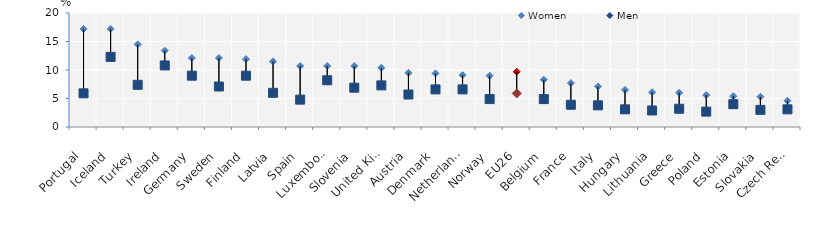
| Category | Women | Men |
|---|---|---|
| Portugal | 17.2 | 5.9 |
| Iceland | 17.2 | 12.3 |
| Turkey | 14.5 | 7.4 |
| Ireland | 13.4 | 10.8 |
| Germany | 12.1 | 9 |
| Sweden | 12.1 | 7.1 |
| Finland | 11.9 | 9 |
| Latvia | 11.5 | 6 |
| Spain | 10.7 | 4.8 |
| Luxembourg | 10.7 | 8.2 |
| Slovenia | 10.7 | 6.9 |
| United Kingdom | 10.4 | 7.3 |
| Austria | 9.5 | 5.7 |
| Denmark | 9.4 | 6.6 |
| Netherlands | 9.1 | 6.6 |
| Norway | 9 | 4.9 |
| EU26 | 9.692 | 5.888 |
| Belgium | 8.3 | 4.9 |
| France | 7.7 | 3.9 |
| Italy | 7.1 | 3.8 |
| Hungary | 6.5 | 3.1 |
| Lithuania | 6.1 | 2.9 |
| Greece | 6 | 3.2 |
| Poland | 5.6 | 2.7 |
| Estonia | 5.4 | 4 |
| Slovakia | 5.3 | 3 |
| Czech Republic | 4.6 | 3.1 |